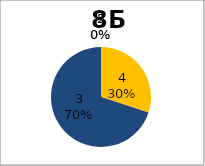
| Category | Series 0 |
|---|---|
| 5.0 | 0 |
| 4.0 | 3 |
| 3.0 | 7 |
| 2.0 | 0 |